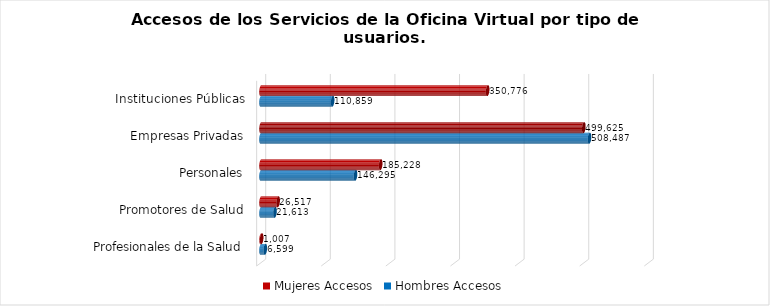
| Category | Mujeres | Hombres |
|---|---|---|
| Instituciones Públicas | 350776 | 110859 |
| Empresas Privadas | 499625 | 508487 |
| Personales | 185228 | 146295 |
| Promotores de Salud | 26517 | 21613 |
| Profesionales de la Salud | 1007 | 6599 |